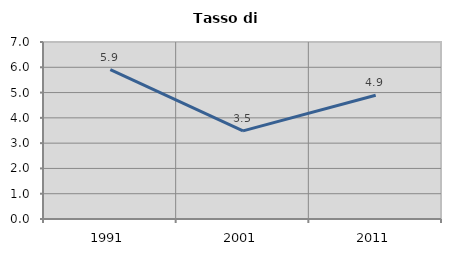
| Category | Tasso di disoccupazione   |
|---|---|
| 1991.0 | 5.907 |
| 2001.0 | 3.484 |
| 2011.0 | 4.895 |